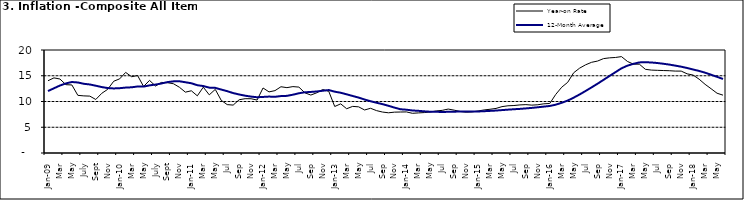
| Category | Year-on Rate | 12-Month Average |
|---|---|---|
| Jan-09 | 14.034 | 12.032 |
| Feb | 14.584 | 12.567 |
| Mar | 14.366 | 13.101 |
| Apr | 13.268 | 13.51 |
| May | 13.212 | 13.787 |
| June | 11.194 | 13.694 |
| July | 11.09 | 13.437 |
| Aug | 11.046 | 13.307 |
| Sept | 10.39 | 13.065 |
| Oct | 11.588 | 12.803 |
| Nov | 12.368 | 12.609 |
| Dec | 13.93 | 12.538 |
| Jan-10 | 14.398 | 12.586 |
| Feb | 15.649 | 12.7 |
| Mar | 14.812 | 12.757 |
| Apr | 15.044 | 12.915 |
| May | 12.915 | 12.893 |
| June | 14.099 | 13.132 |
| July | 13.002 | 13.284 |
| Aug | 13.702 | 13.5 |
| Sept | 13.65 | 13.764 |
| Oct | 13.45 | 13.908 |
| Nov | 12.766 | 13.928 |
| Dec | 11.815 | 13.74 |
| Jan-11 | 12.08 | 13.542 |
| Feb | 11.1 | 13.161 |
| Mar | 12.779 | 13.001 |
| Apr | 11.291 | 12.694 |
| May | 12.352 | 12.648 |
| Jun | 10.23 | 12.321 |
| Jul | 9.397 | 12.009 |
| Aug | 9.301 | 11.635 |
| Sep | 10.339 | 11.363 |
| Oct | 10.544 | 11.13 |
| Nov | 10.54 | 10.952 |
| Dec | 10.283 | 10.826 |
| Jan-12 | 12.626 | 10.886 |
| Feb | 11.866 | 10.955 |
| Mar | 12.111 | 10.914 |
| Apr | 12.866 | 11.054 |
| May | 12.688 | 11.096 |
| Jun | 12.892 | 11.32 |
| Jul | 12.797 | 11.599 |
| Aug | 11.689 | 11.791 |
| Sep | 11.253 | 11.859 |
| Oct | 11.693 | 11.948 |
| Nov | 12.32 | 12.091 |
| Dec | 11.981 | 12.224 |
| Jan-13 | 9.031 | 11.908 |
| Feb | 9.542 | 11.703 |
| Mar | 8.593 | 11.394 |
| Apr | 9.052 | 11.072 |
| May | 8.964 | 10.761 |
| Jun | 8.353 | 10.383 |
| Jul | 8.682 | 10.047 |
| Aug | 8.231 | 9.761 |
| Sep | 7.952 | 9.486 |
| Oct | 7.807 | 9.167 |
| Nov | 7.931 | 8.815 |
| Dec | 7.957 | 8.496 |
| Jan-14 | 7.977 | 8.408 |
| Feb | 7.707 | 8.257 |
| Mar | 7.783 | 8.19 |
| Apr | 7.851 | 8.092 |
| May | 7.965 | 8.012 |
| Jun | 8.167 | 7.998 |
| Jul | 8.281 | 7.968 |
| Aug | 8.534 | 7.996 |
| Sep | 8.317 | 8.027 |
| Oct | 8.06 | 8.047 |
| Nov | 7.927 | 8.046 |
| Dec | 7.978 | 8.047 |
| Jan-15 | 8.157 | 8.063 |
| Feb | 8.359 | 8.117 |
| Mar | 8.494 | 8.176 |
| Apr | 8.655 | 8.243 |
| May | 9.003 | 8.331 |
| Jun | 9.168 | 8.417 |
| Jul | 9.218 | 8.497 |
| Aug | 9.336 | 8.566 |
| Sep | 9.394 | 8.658 |
| Oct | 9.296 | 8.76 |
| Nov | 9.368 | 8.879 |
| Dec | 9.554 | 9.009 |
| Jan-16 | 9.617 | 9.13 |
| Feb | 11.379 | 9.386 |
| Mar | 12.775 | 9.751 |
| Apr | 13.721 | 10.182 |
| May | 15.577 | 10.746 |
| Jun | 16.48 | 11.372 |
| Jul | 17.127 | 12.045 |
| Aug | 17.609 | 12.744 |
| Sep | 17.852 | 13.454 |
| Oct | 18.33 | 14.206 |
| Nov | 18.476 | 14.958 |
| Dec | 18.547 | 15.697 |
| Jan-17 | 18.719 | 16.441 |
| Feb | 17.78 | 16.958 |
| Mar | 17.256 | 17.315 |
| Apr | 17.244 | 17.591 |
| May | 16.251 | 17.628 |
| Jun | 16.098 | 17.578 |
| Jul | 16.053 | 17.475 |
| Aug | 16.012 | 17.331 |
| Sep | 15.979 | 17.17 |
| Oct | 15.905 | 16.968 |
| Nov | 15.901 | 16.76 |
| Dec | 15.372 | 16.502 |
| Jan-18 | 15.127 | 16.215 |
| Feb | 14.33 | 15.93 |
| Mar | 13.337 | 15.599 |
| Apr | 12.482 | 15.196 |
| May | 11.608 | 14.793 |
| June | 11.231 | 14.371 |